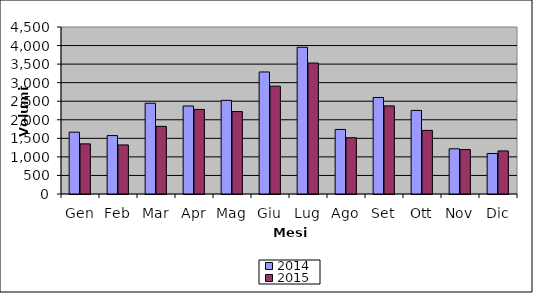
| Category | 2014 | 2015 |
|---|---|---|
| Gen | 1666 | 1351 |
| Feb | 1574 | 1322 |
| Mar | 2445 | 1823 |
| Apr | 2371 | 2279 |
| Mag | 2524 | 2221 |
| Giu | 3288 | 2906 |
| Lug | 3954 | 3528 |
| Ago | 1739 | 1516 |
| Set | 2601 | 2374 |
| Ott | 2252 | 1714 |
| Nov | 1218 | 1198 |
| Dic | 1092 | 1160 |